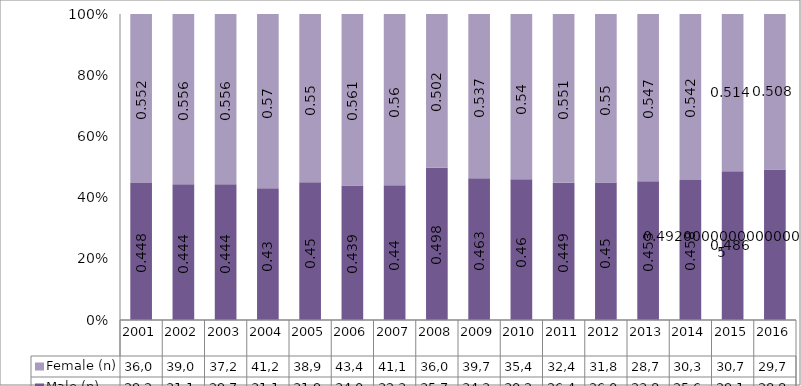
| Category | Male (n) | Female (n) |
|---|---|---|
| 2001.0 | 29247 | 36086 |
| 2002.0 | 31179 | 39098 |
| 2003.0 | 29754 | 37281 |
| 2004.0 | 31109 | 41200 |
| 2005.0 | 31917 | 38962 |
| 2006.0 | 34025 | 43400 |
| 2007.0 | 32365 | 41184 |
| 2008.0 | 35743 | 36053 |
| 2009.0 | 34324 | 39766 |
| 2010.0 | 30222 | 35498 |
| 2011.0 | 26418 | 32441 |
| 2012.0 | 26052 | 31891 |
| 2013.0 | 23803 | 28717 |
| 2014.0 | 25608 | 30342 |
| 2015.0 | 29109 | 30758 |
| 2016.0 | 28833 | 29774 |